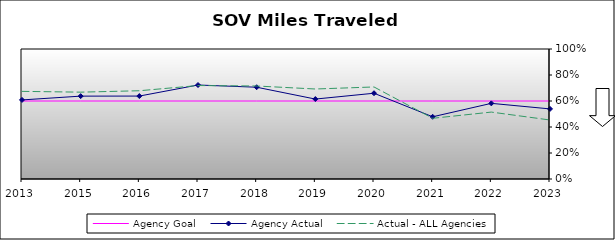
| Category | Agency Goal | Agency Actual | Actual - ALL Agencies |
|---|---|---|---|
| 2013.0 | 0.6 | 0.608 | 0.674 |
| 2015.0 | 0.6 | 0.637 | 0.668 |
| 2016.0 | 0.6 | 0.638 | 0.679 |
| 2017.0 | 0.6 | 0.723 | 0.719 |
| 2018.0 | 0.6 | 0.706 | 0.715 |
| 2019.0 | 0.6 | 0.615 | 0.692 |
| 2020.0 | 0.6 | 0.66 | 0.708 |
| 2021.0 | 0.6 | 0.478 | 0.467 |
| 2022.0 | 0.6 | 0.582 | 0.515 |
| 2023.0 | 0.6 | 0.539 | 0.454 |